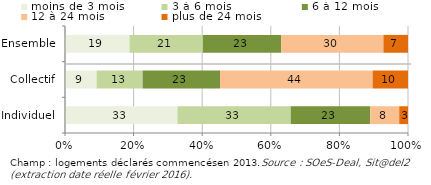
| Category | moins de 3 mois | 3 à 6 mois | 6 à 12 mois | 12 à 24 mois | plus de 24 mois |
|---|---|---|---|---|---|
| Individuel | 32.79 | 33.023 | 23.166 | 8.459 | 2.561 |
| Collectif | 9.222 | 13.406 | 22.575 | 44.483 | 10.314 |
| Ensemble | 18.815 | 21.39 | 22.828 | 29.81 | 7.156 |